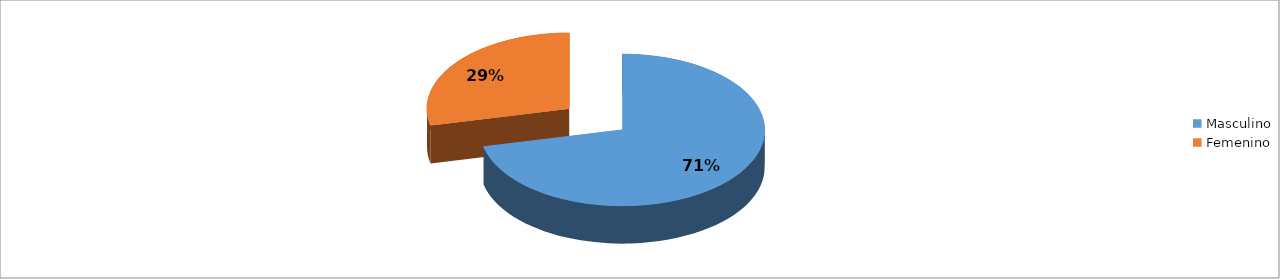
| Category | Series 0 |
|---|---|
| Masculino | 0.714 |
| Femenino | 0.286 |